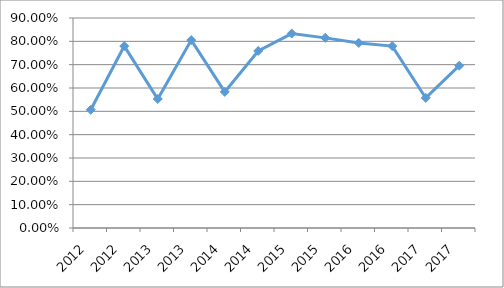
| Category | EQDI-F2O43 |
|---|---|
| 2012.0 | 0.507 |
| 2012.0 | 0.78 |
| 2013.0 | 0.553 |
| 2013.0 | 0.805 |
| 2014.0 | 0.583 |
| 2014.0 | 0.759 |
| 2015.0 | 0.833 |
| 2015.0 | 0.815 |
| 2016.0 | 0.793 |
| 2016.0 | 0.78 |
| 2017.0 | 0.557 |
| 2017.0 | 0.696 |